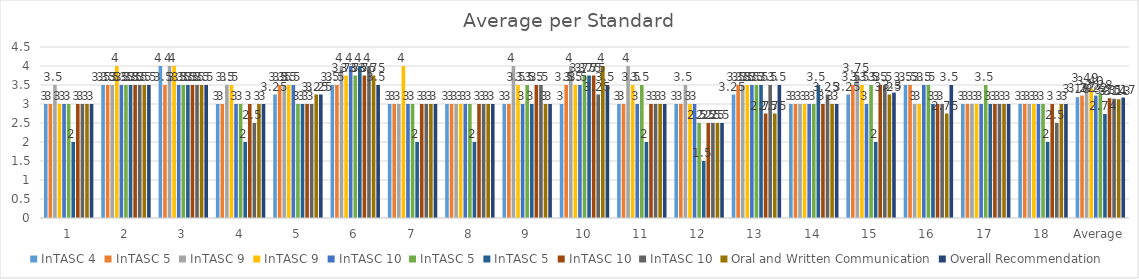
| Category | InTASC 4 | InTASC 5 | InTASC 9 | InTASC 10 | Oral and Written Communication | Overall Recommendation |
|---|---|---|---|---|---|---|
| 1 | 3 | 2 | 3 | 3 | 3 | 3 |
| 2 | 3.5 | 3.5 | 4 | 3.5 | 3.5 | 3.5 |
| 3 | 4 | 3.5 | 4 | 3.5 | 3.5 | 3.5 |
| 4 | 3 | 2 | 3.5 | 2.5 | 3 | 3 |
| 5 | 3.25 | 3 | 3.5 | 3 | 3.25 | 3.25 |
| 6 | 3.5 | 4 | 3.75 | 4 | 3.75 | 3.5 |
| 7 | 3 | 2 | 4 | 3 | 3 | 3 |
| 8 | 3 | 2 | 3 | 3 | 3 | 3 |
| 9 | 3 | 3 | 3.5 | 3.5 | 3 | 3 |
| 10 | 3 | 3.75 | 3.5 | 3.25 | 4 | 3.5 |
| 11 | 3 | 2 | 3.5 | 3 | 3 | 3 |
| 12 | 3 | 1.5 | 3 | 2.5 | 2.5 | 2.5 |
| 13 | 3.25 | 3.5 | 3.5 | 3.5 | 2.75 | 3.5 |
| 14 | 3 | 3.5 | 3 | 3.25 | 3 | 3 |
| 15 | 3.25 | 2 | 3.5 | 3.5 | 3.25 | 3.3 |
| 16 | 3.5 | 3 | 3 | 3 | 2.75 | 3.5 |
| 17 | 3 | 3 | 3 | 3 | 3 | 3 |
| 18 | 3 | 2 | 3 | 2.5 | 3 | 3 |
| Average | 3.181 | 2.736 | 3.403 | 3.139 | 3.125 | 3.169 |